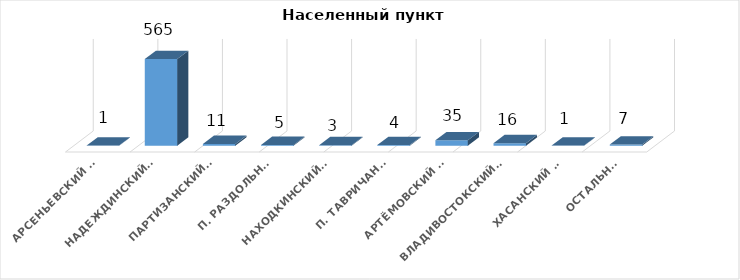
| Category | количество |
|---|---|
| Арсеньевский ГО | 1 |
| Надеждинский МР | 565 |
| Партизанский ГО | 11 |
| п. Раздольное | 5 |
| Находкинский ГО | 3 |
| п. Тавричанка | 4 |
| Артёмовский ГО | 35 |
| Владивостокский ГО | 16 |
| Хасанский МР | 1 |
| Остальные | 7 |